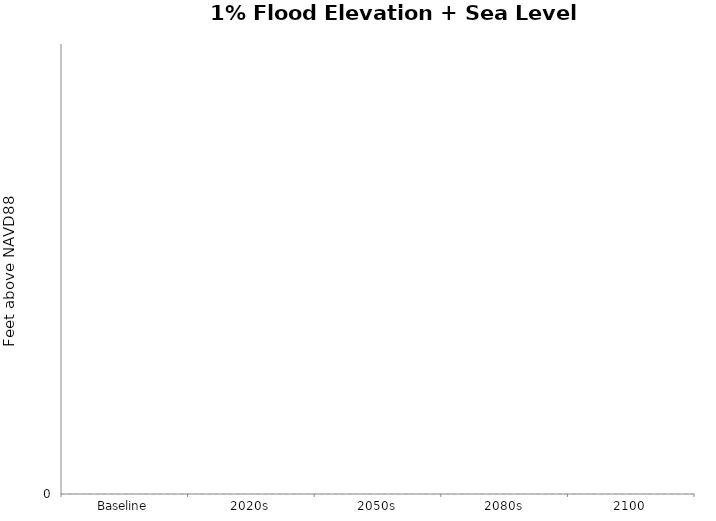
| Category | High | High-Mid | Mid | Low-Mid | Low |
|---|---|---|---|---|---|
| Baseline | 0 | 0 | 0 | 0 | 0 |
| 2020s | 0 | 0 | 0 | 0 | 0 |
| 2050s | 0 | 0 | 0 | 0 | 0 |
| 2080s | 0 | 0 | 0 | 0 | 0 |
| 2100 | 0 | 0 | 0 | 0 | 0 |